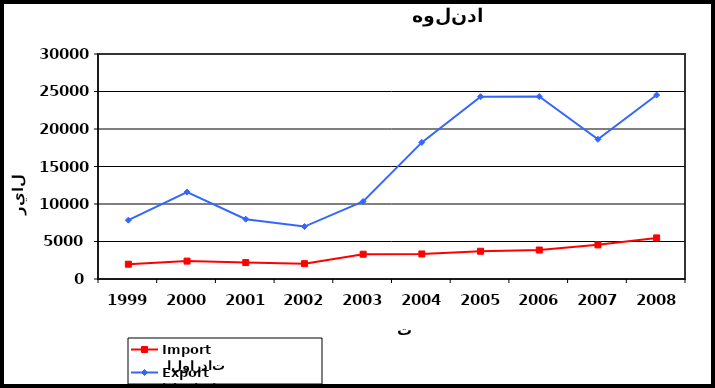
| Category |  الواردات           Import | الصادرات          Export |
|---|---|---|
| 1999.0 | 1971 | 7845 |
| 2000.0 | 2387 | 11592 |
| 2001.0 | 2190 | 7971 |
| 2002.0 | 2045 | 6989 |
| 2003.0 | 3306 | 10338 |
| 2004.0 | 3338 | 18216 |
| 2005.0 | 3703 | 24308 |
| 2006.0 | 3865 | 24331 |
| 2007.0 | 4552 | 18630 |
| 2008.0 | 5479 | 24529 |